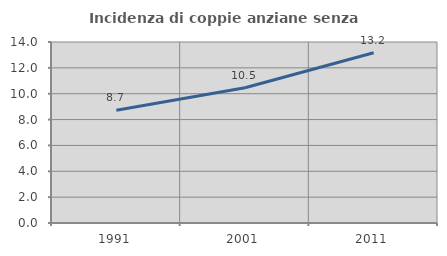
| Category | Incidenza di coppie anziane senza figli  |
|---|---|
| 1991.0 | 8.721 |
| 2001.0 | 10.466 |
| 2011.0 | 13.166 |